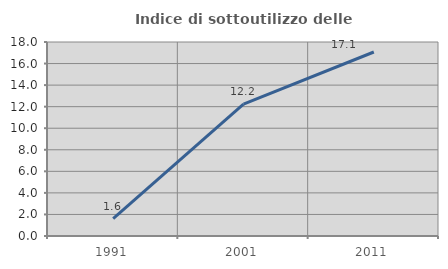
| Category | Indice di sottoutilizzo delle abitazioni  |
|---|---|
| 1991.0 | 1.613 |
| 2001.0 | 12.245 |
| 2011.0 | 17.073 |